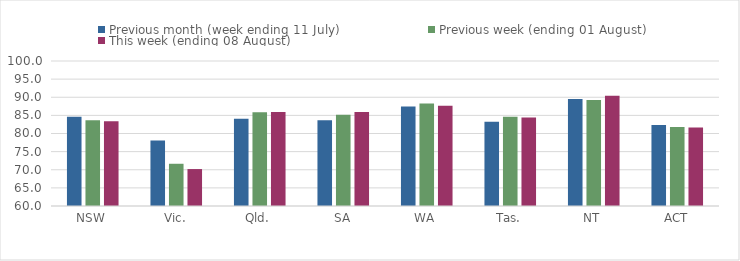
| Category | Previous month (week ending 11 July) | Previous week (ending 01 August) | This week (ending 08 August) |
|---|---|---|---|
| NSW | 84.594 | 83.632 | 83.406 |
| Vic. | 78.035 | 71.65 | 70.19 |
| Qld. | 84.044 | 85.852 | 85.93 |
| SA | 83.636 | 85.169 | 85.956 |
| WA | 87.456 | 88.257 | 87.682 |
| Tas. | 83.254 | 84.605 | 84.43 |
| NT | 89.541 | 89.215 | 90.425 |
| ACT | 82.364 | 81.781 | 81.633 |